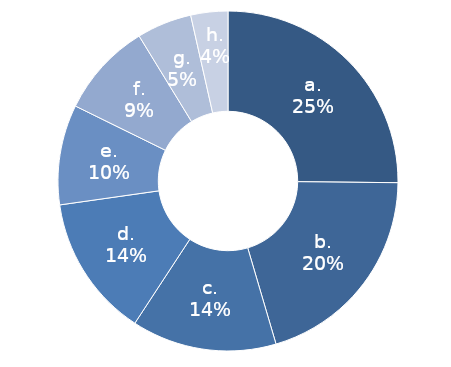
| Category | Series 0 |
|---|---|
| a. | 25.16 |
| b. | 20.282 |
| c. | 13.789 |
| d. | 13.521 |
| e. | 9.515 |
| f. | 8.981 |
| g. | 5.227 |
| h. | 3.525 |